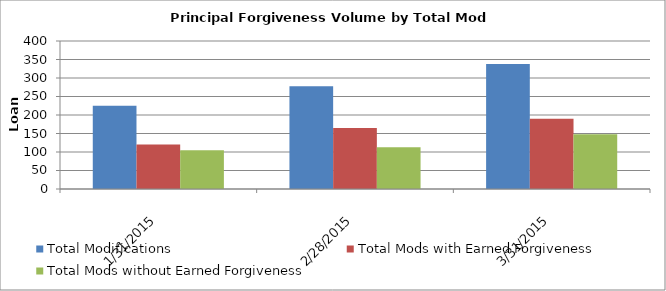
| Category | Total Modifications | Total Mods with Earned Forgiveness | Total Mods without Earned Forgiveness |
|---|---|---|---|
| 1/31/15 | 225 | 120 | 105 |
| 2/28/15 | 278 | 165 | 113 |
| 3/31/15 | 338 | 190 | 148 |